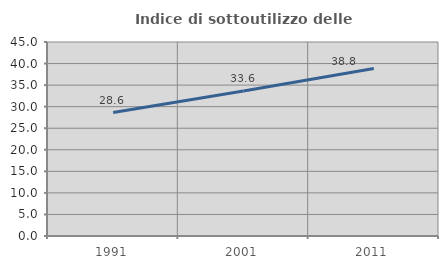
| Category | Indice di sottoutilizzo delle abitazioni  |
|---|---|
| 1991.0 | 28.627 |
| 2001.0 | 33.621 |
| 2011.0 | 38.832 |